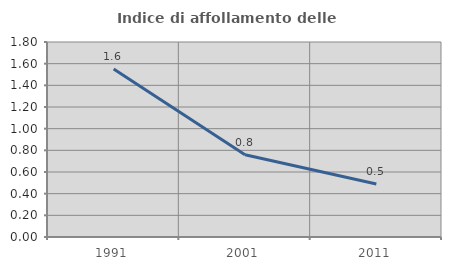
| Category | Indice di affollamento delle abitazioni  |
|---|---|
| 1991.0 | 1.55 |
| 2001.0 | 0.76 |
| 2011.0 | 0.488 |